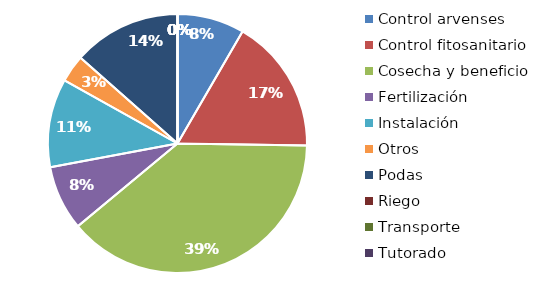
| Category | Valor |
|---|---|
| Control arvenses | 2183000 |
| Control fitosanitario | 4403000 |
| Cosecha y beneficio | 10101000 |
| Fertilización | 2109000 |
| Instalación | 2886000 |
| Otros | 888000 |
| Podas | 3515000 |
| Riego | 0 |
| Transporte | 0 |
| Tutorado | 0 |